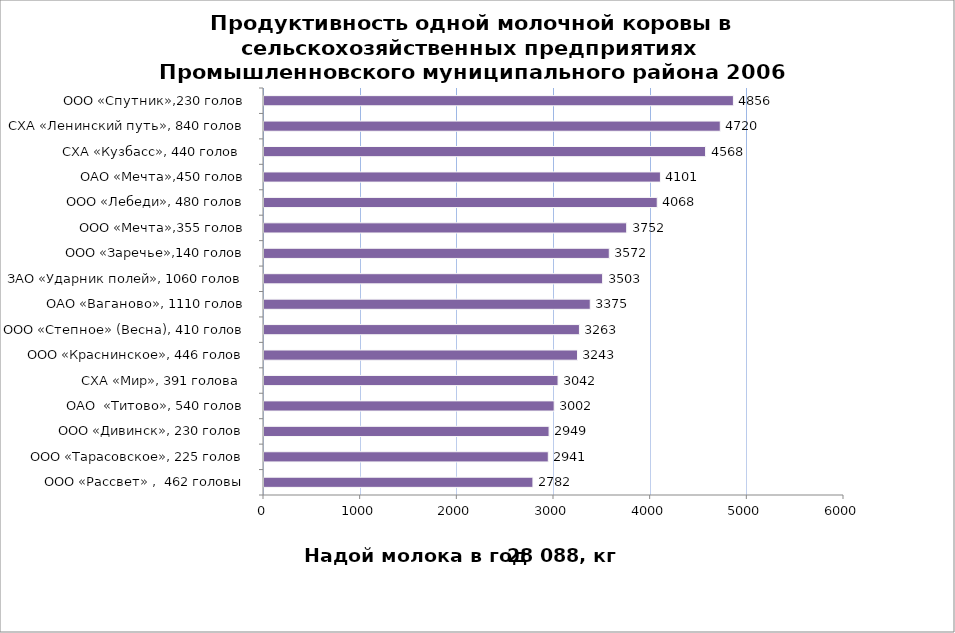
| Category | Series 0 |
|---|---|
| ООО «Рассвет» ,  462 головы | 2782 |
| ООО «Тарасовское», 225 голов | 2941 |
| ООО «Дивинск», 230 голов | 2949 |
| ОАО  «Титово», 540 голов | 3002 |
|  СХА «Мир», 391 голова  | 3042 |
| ООО «Краснинское», 446 голов | 3243 |
| ООО «Степное» (Весна), 410 голов | 3263 |
| ОАО «Ваганово», 1110 голов | 3375 |
|  ЗАО «Ударник полей», 1060 голов | 3503 |
|  ООО «Заречье»,140 голов | 3572 |
| ООО «Мечта»,355 голов | 3752 |
| ООО «Лебеди», 480 голов | 4068 |
| ОАО «Мечта»,450 голов | 4101 |
|  СХА «Кузбасс», 440 голов  | 4568 |
|   СХА «Ленинский путь», 840 голов | 4720 |
| ООО «Спутник»,230 голов | 4856 |